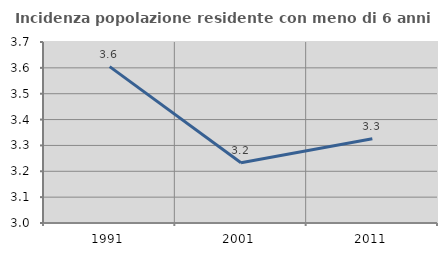
| Category | Incidenza popolazione residente con meno di 6 anni |
|---|---|
| 1991.0 | 3.605 |
| 2001.0 | 3.233 |
| 2011.0 | 3.326 |